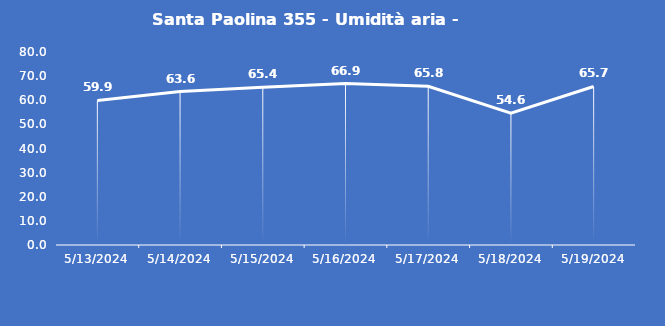
| Category | Santa Paolina 355 - Umidità aria - Grezzo (%) |
|---|---|
| 5/13/24 | 59.9 |
| 5/14/24 | 63.6 |
| 5/15/24 | 65.4 |
| 5/16/24 | 66.9 |
| 5/17/24 | 65.8 |
| 5/18/24 | 54.6 |
| 5/19/24 | 65.7 |